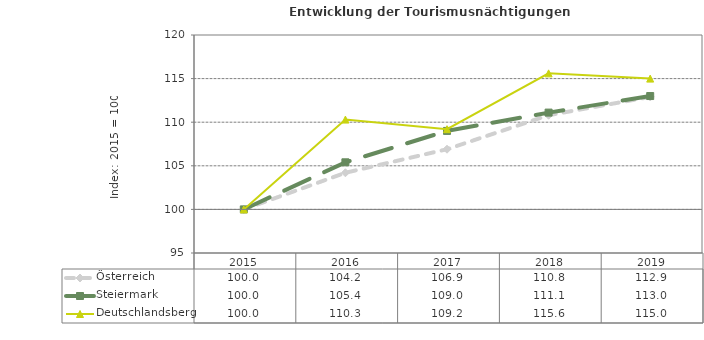
| Category | Österreich | Steiermark | Deutschlandsberg |
|---|---|---|---|
| 2019.0 | 112.9 | 113 | 115 |
| 2018.0 | 110.8 | 111.1 | 115.6 |
| 2017.0 | 106.9 | 109 | 109.2 |
| 2016.0 | 104.2 | 105.4 | 110.3 |
| 2015.0 | 100 | 100 | 100 |